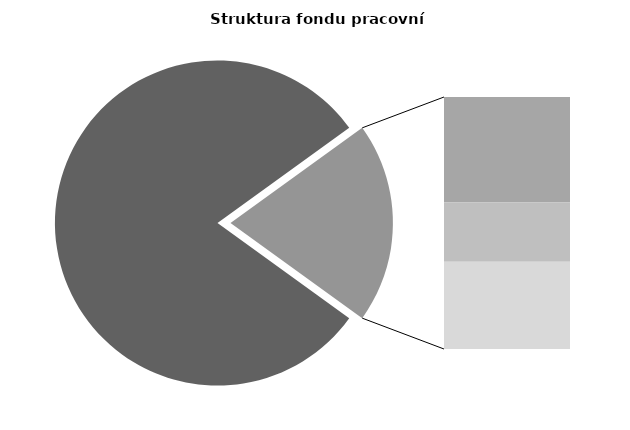
| Category | Series 0 |
|---|---|
| Průměrná měsíční odpracovaná doba bez přesčasu | 136.054 |
| Dovolená | 14.126 |
| Nemoc | 8.004 |
| Jiné | 11.697 |